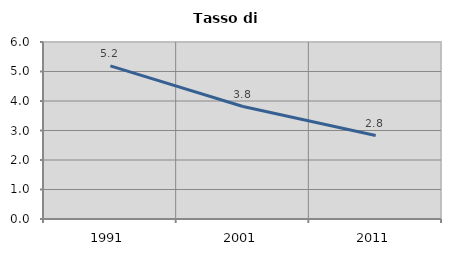
| Category | Tasso di disoccupazione   |
|---|---|
| 1991.0 | 5.189 |
| 2001.0 | 3.814 |
| 2011.0 | 2.83 |